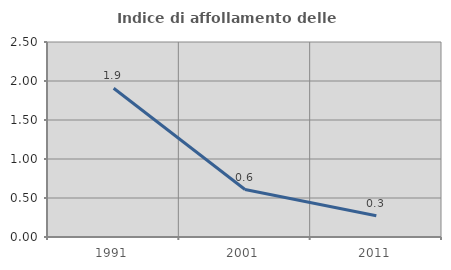
| Category | Indice di affollamento delle abitazioni  |
|---|---|
| 1991.0 | 1.906 |
| 2001.0 | 0.609 |
| 2011.0 | 0.271 |